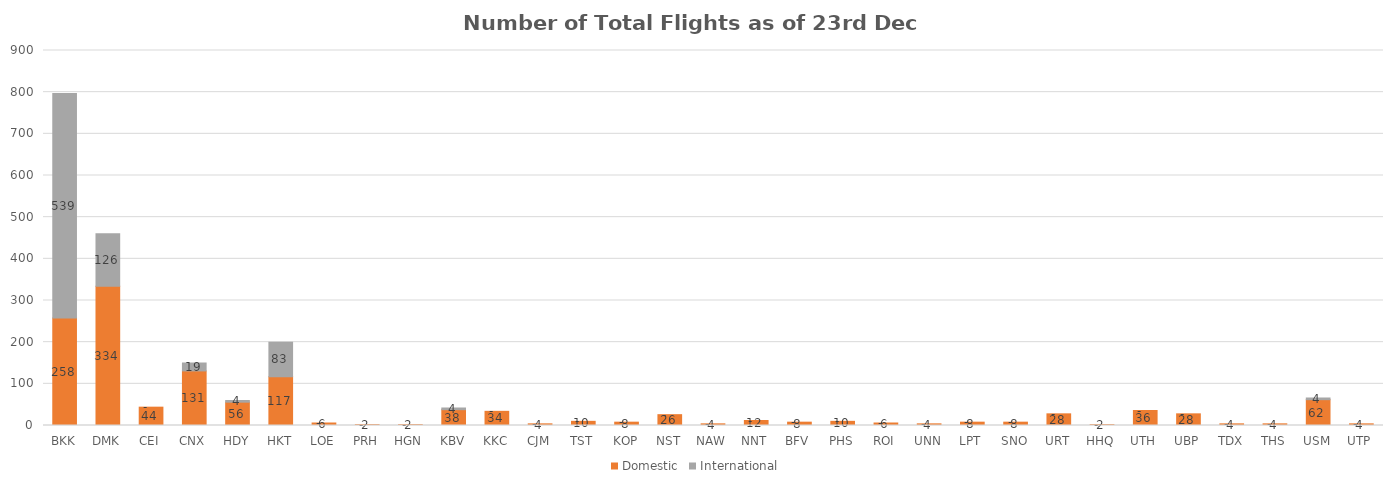
| Category | Domestic | International |
|---|---|---|
| BKK | 258 | 539 |
| DMK | 334 | 126 |
| CEI | 44 | 0 |
| CNX | 131 | 19 |
| HDY | 56 | 4 |
| HKT | 117 | 83 |
| LOE | 6 | 0 |
| PRH | 2 | 0 |
| HGN | 2 | 0 |
| KBV | 38 | 4 |
| KKC | 34 | 0 |
| CJM | 4 | 0 |
| TST | 10 | 0 |
| KOP | 8 | 0 |
| NST | 26 | 0 |
| NAW | 4 | 0 |
| NNT | 12 | 0 |
| BFV | 8 | 0 |
| PHS | 10 | 0 |
| ROI | 6 | 0 |
| UNN | 4 | 0 |
| LPT | 8 | 0 |
| SNO | 8 | 0 |
| URT | 28 | 0 |
| HHQ | 2 | 0 |
| UTH | 36 | 0 |
| UBP | 28 | 0 |
| TDX | 4 | 0 |
| THS | 4 | 0 |
| USM | 62 | 4 |
| UTP | 4 | 0 |